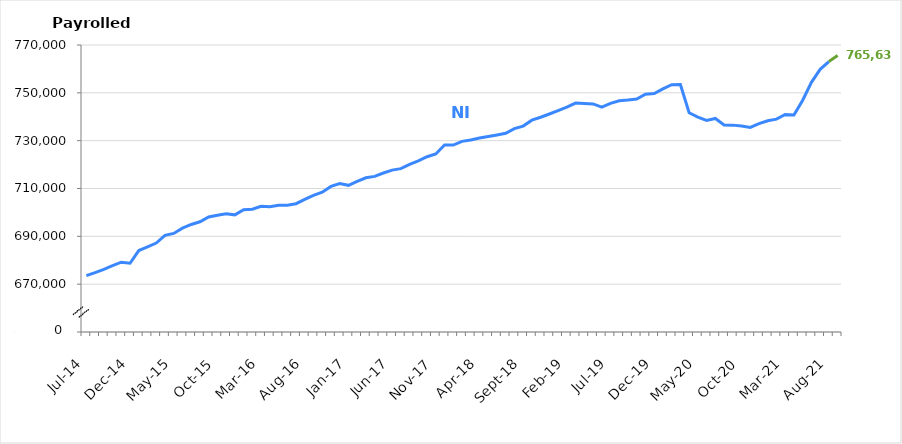
| Category | NI |
|---|---|
| Jul-14 | 673551 |
| Aug-14 | 674830 |
| Sep-14 | 676209 |
| Oct-14 | 677726 |
| Nov-14 | 679173 |
| Dec-14 | 678740 |
| Jan-15 | 684065 |
| Feb-15 | 685617 |
| Mar-15 | 687204 |
| Apr-15 | 690411 |
| May-15 | 691221 |
| Jun-15 | 693434 |
| Jul-15 | 694959 |
| Aug-15 | 696087 |
| Sep-15 | 698098 |
| Oct-15 | 698805 |
| Nov-15 | 699416 |
| Dec-15 | 698989 |
| Jan-16 | 701104 |
| Feb-16 | 701305 |
| Mar-16 | 702528 |
| Apr-16 | 702361 |
| May-16 | 703003 |
| Jun-16 | 703027 |
| Jul-16 | 703643 |
| Aug-16 | 705455 |
| Sep-16 | 707128 |
| Oct-16 | 708478 |
| Nov-16 | 710872 |
| Dec-16 | 712028 |
| Jan-17 | 711324 |
| Feb-17 | 712982 |
| Mar-17 | 714479 |
| Apr-17 | 715076 |
| May-17 | 716476 |
| Jun-17 | 717683 |
| Jul-17 | 718300 |
| Aug-17 | 720095 |
| Sep-17 | 721547 |
| Oct-17 | 723270 |
| Nov-17 | 724448 |
| Dec-17 | 728200 |
| Jan-18 | 728151 |
| Feb-18 | 729719 |
| Mar-18 | 730267 |
| Apr-18 | 731106 |
| May-18 | 731752 |
| Jun-18 | 732368 |
| Jul-18 | 733060 |
| Aug-18 | 735011 |
| Sep-18 | 736088 |
| Oct-18 | 738557 |
| Nov-18 | 739804 |
| Dec-18 | 741147 |
| Jan-19 | 742563 |
| Feb-19 | 744017 |
| Mar-19 | 745706 |
| Apr-19 | 745534 |
| May-19 | 745368 |
| Jun-19 | 744018 |
| Jul-19 | 745602 |
| Aug-19 | 746697 |
| Sep-19 | 746965 |
| Oct-19 | 747391 |
| Nov-19 | 749423 |
| Dec-19 | 749730 |
| Jan-20 | 751659 |
| Feb-20 | 753381 |
| Mar-20 | 753456 |
| Apr-20 | 741660 |
| May-20 | 739808 |
| Jun-20 | 738474 |
| Jul-20 | 739280 |
| Aug-20 | 736586 |
| Sep-20 | 736497 |
| Oct-20 | 736133 |
| Nov-20 | 735554 |
| Dec-20 | 737104 |
| Jan-21 | 738295 |
| Feb-21 | 738987 |
| Mar-21 | 740942 |
| Apr-21 | 740766 |
| May-21 | 746925 |
| Jun-21 | 754407 |
| Jul-21 | 759831 |
| Aug-21 | 763092 |
| Sep-21 | 765630 |